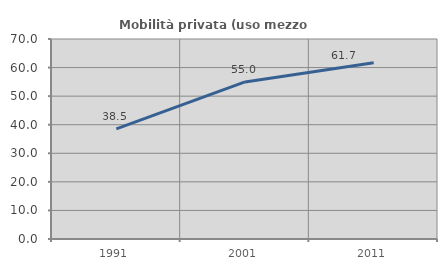
| Category | Mobilità privata (uso mezzo privato) |
|---|---|
| 1991.0 | 38.547 |
| 2001.0 | 54.967 |
| 2011.0 | 61.652 |